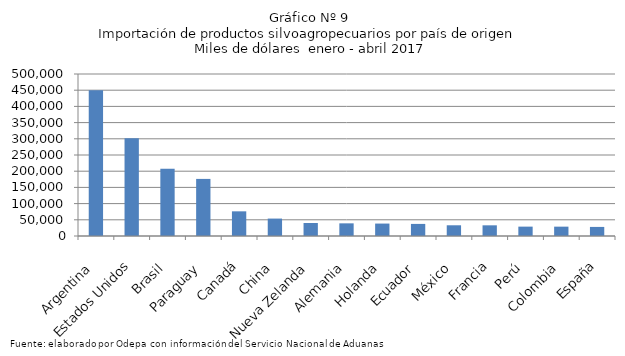
| Category | Series 0 |
|---|---|
| Argentina | 449708.65 |
| Estados Unidos | 301991.25 |
| Brasil | 207380.229 |
| Paraguay | 176221.224 |
| Canadá | 76132.929 |
| China | 53773.406 |
| Nueva Zelanda | 40145.434 |
| Alemania | 39063.648 |
| Holanda | 38371.052 |
| Ecuador | 37310.051 |
| México | 33068.817 |
| Francia | 32946.728 |
| Perú | 28927.475 |
| Colombia | 28851.618 |
| España | 28013.307 |